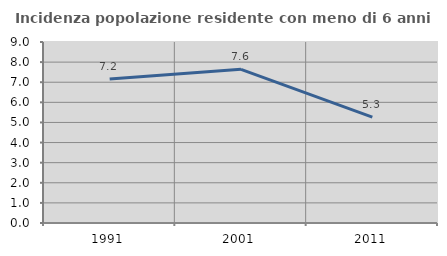
| Category | Incidenza popolazione residente con meno di 6 anni |
|---|---|
| 1991.0 | 7.155 |
| 2001.0 | 7.642 |
| 2011.0 | 5.265 |